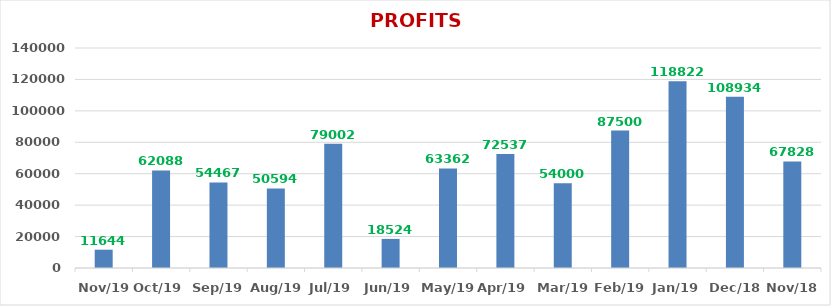
| Category | PROFITS (Rs.) |
|---|---|
| 2019-11-01 | 11644 |
| 2019-10-01 | 62088 |
| 2019-09-01 | 54467 |
| 2019-08-01 | 50594 |
| 2019-07-01 | 79002 |
| 2019-06-01 | 18524 |
| 2019-05-01 | 63362 |
| 2019-04-01 | 72537 |
| 2019-03-01 | 54000 |
| 2019-02-01 | 87500 |
| 2019-01-01 | 118822 |
| 2018-12-01 | 108934 |
| 2018-11-01 | 67828 |